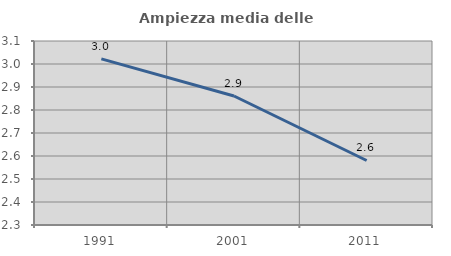
| Category | Ampiezza media delle famiglie |
|---|---|
| 1991.0 | 3.022 |
| 2001.0 | 2.861 |
| 2011.0 | 2.58 |